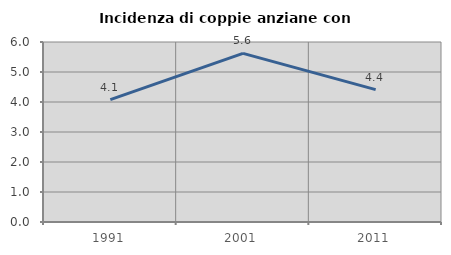
| Category | Incidenza di coppie anziane con figli |
|---|---|
| 1991.0 | 4.082 |
| 2001.0 | 5.621 |
| 2011.0 | 4.412 |